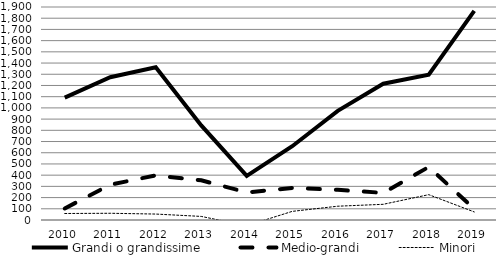
| Category | Grandi o grandissime | Medio-grandi | Minori |
|---|---|---|---|
| 2010.0 | 1092 | 103 | 58 |
| 2011.0 | 1274 | 315 | 60 |
| 2012.0 | 1362 | 398 | 53 |
| 2013.0 | 844 | 354 | 32 |
| 2014.0 | 393 | 246 | -51 |
| 2015.0 | 658 | 286 | 77 |
| 2016.0 | 974 | 269 | 123 |
| 2017.0 | 1216 | 242 | 140 |
| 2018.0 | 1296 | 473 | 226 |
| 2019.0 | 1866 | 99 | 72 |